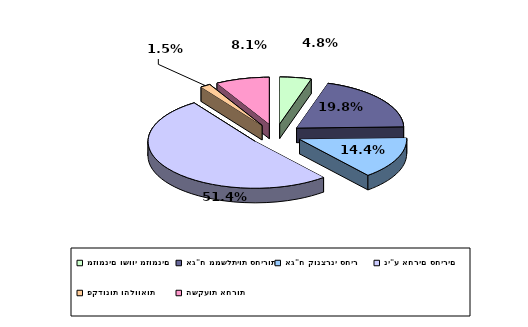
| Category | Series 0 |
|---|---|
| מזומנים ושווי מזומנים | 0.048 |
| אג"ח ממשלתיות סחירות | 0.198 |
| אג"ח קונצרני סחיר | 0.144 |
| ני"ע אחרים סחירים | 0.514 |
| פקדונות והלוואות | 0.015 |
| השקעות אחרות | 0.081 |